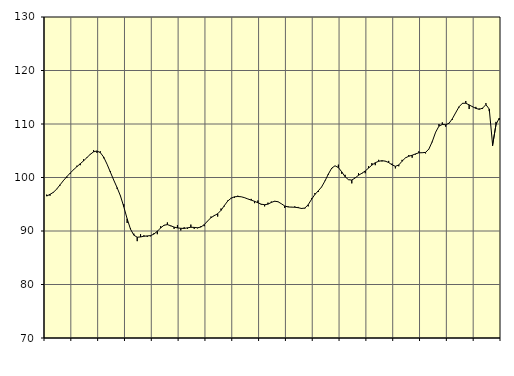
| Category | Piggar | Samtliga fast anställda (inkl. fast anställda utomlands) |
|---|---|---|
| nan | 96.8 | 96.53 |
| 87.0 | 96.6 | 96.85 |
| 87.0 | 97.3 | 97.23 |
| 87.0 | 97.8 | 97.84 |
| nan | 98.5 | 98.64 |
| 88.0 | 99.5 | 99.43 |
| 88.0 | 99.9 | 100.15 |
| 88.0 | 100.7 | 100.82 |
| nan | 101.5 | 101.44 |
| 89.0 | 102.2 | 102.02 |
| 89.0 | 102.3 | 102.57 |
| 89.0 | 103.4 | 103.11 |
| nan | 103.8 | 103.72 |
| 90.0 | 104.4 | 104.33 |
| 90.0 | 105.1 | 104.8 |
| 90.0 | 104.6 | 104.96 |
| nan | 104.9 | 104.65 |
| 91.0 | 103.6 | 103.81 |
| 91.0 | 102.5 | 102.5 |
| 91.0 | 101.2 | 101 |
| nan | 99.5 | 99.51 |
| 92.0 | 97.9 | 98.11 |
| 92.0 | 96.6 | 96.56 |
| 92.0 | 95 | 94.54 |
| nan | 91.5 | 92.28 |
| 93.0 | 90.5 | 90.35 |
| 93.0 | 89.5 | 89.22 |
| 93.0 | 88.1 | 88.84 |
| nan | 89.4 | 88.89 |
| 94.0 | 89.2 | 89.02 |
| 94.0 | 88.9 | 89.08 |
| 94.0 | 89 | 89.14 |
| nan | 89.6 | 89.43 |
| 95.0 | 89.4 | 89.95 |
| 95.0 | 90.9 | 90.58 |
| 95.0 | 91 | 91.08 |
| nan | 91.6 | 91.19 |
| 96.0 | 90.9 | 90.98 |
| 96.0 | 90.4 | 90.73 |
| 96.0 | 91.1 | 90.58 |
| nan | 90.1 | 90.51 |
| 97.0 | 90.7 | 90.48 |
| 97.0 | 90.4 | 90.59 |
| 97.0 | 91.2 | 90.7 |
| nan | 90.4 | 90.67 |
| 98.0 | 90.5 | 90.6 |
| 98.0 | 90.9 | 90.74 |
| 98.0 | 90.9 | 91.19 |
| nan | 91.9 | 91.87 |
| 99.0 | 92.7 | 92.49 |
| 99.0 | 93 | 92.87 |
| 99.0 | 92.7 | 93.23 |
| nan | 94.2 | 93.86 |
| 0.0 | 94.6 | 94.76 |
| 0.0 | 95.7 | 95.6 |
| 0.0 | 96.2 | 96.12 |
| nan | 96.2 | 96.39 |
| 1.0 | 96.6 | 96.45 |
| 1.0 | 96.4 | 96.4 |
| 1.0 | 96.2 | 96.23 |
| nan | 96 | 95.99 |
| 2.0 | 96 | 95.77 |
| 2.0 | 95.2 | 95.55 |
| 2.0 | 95.7 | 95.28 |
| nan | 94.9 | 95.01 |
| 3.0 | 94.6 | 94.91 |
| 3.0 | 95.3 | 95.02 |
| 3.0 | 95.5 | 95.34 |
| nan | 95.5 | 95.57 |
| 4.0 | 95.5 | 95.47 |
| 4.0 | 95.1 | 95.09 |
| 4.0 | 94.3 | 94.68 |
| nan | 94.6 | 94.49 |
| 5.0 | 94.5 | 94.46 |
| 5.0 | 94.6 | 94.44 |
| 5.0 | 94.5 | 94.36 |
| nan | 94.3 | 94.21 |
| 6.0 | 94.2 | 94.29 |
| 6.0 | 94.6 | 94.92 |
| 6.0 | 96.1 | 95.92 |
| nan | 97.1 | 96.83 |
| 7.0 | 97.3 | 97.5 |
| 7.0 | 98.2 | 98.24 |
| 7.0 | 99.4 | 99.35 |
| nan | 100.5 | 100.63 |
| 8.0 | 101.6 | 101.74 |
| 8.0 | 102.2 | 102.19 |
| 8.0 | 102.4 | 101.86 |
| nan | 100.7 | 101.05 |
| 9.0 | 100.5 | 100.15 |
| 9.0 | 99.6 | 99.59 |
| 9.0 | 98.9 | 99.52 |
| nan | 100 | 99.91 |
| 10.0 | 100.8 | 100.42 |
| 10.0 | 100.7 | 100.79 |
| 10.0 | 100.8 | 101.22 |
| nan | 102.1 | 101.76 |
| 11.0 | 102.7 | 102.32 |
| 11.0 | 102.3 | 102.76 |
| 11.0 | 103.3 | 103.03 |
| nan | 103 | 103.14 |
| 12.0 | 103 | 103.06 |
| 12.0 | 103.1 | 102.79 |
| 12.0 | 102.6 | 102.37 |
| nan | 101.7 | 102.09 |
| 13.0 | 102.1 | 102.34 |
| 13.0 | 103.3 | 103.05 |
| 13.0 | 103.7 | 103.67 |
| nan | 104.2 | 103.97 |
| 14.0 | 103.7 | 104.16 |
| 14.0 | 104.3 | 104.41 |
| 14.0 | 104.9 | 104.62 |
| nan | 104.6 | 104.63 |
| 15.0 | 104.5 | 104.69 |
| 15.0 | 105.3 | 105.33 |
| 15.0 | 106.6 | 106.71 |
| nan | 108.5 | 108.46 |
| 16.0 | 110 | 109.61 |
| 16.0 | 110.3 | 109.91 |
| 16.0 | 109.5 | 109.86 |
| nan | 110.2 | 110.14 |
| 17.0 | 110.8 | 110.99 |
| 17.0 | 112.1 | 112.13 |
| 17.0 | 113.1 | 113.23 |
| nan | 113.8 | 113.87 |
| 18.0 | 114.3 | 113.88 |
| 18.0 | 112.8 | 113.57 |
| 18.0 | 113.3 | 113.23 |
| nan | 113.2 | 112.92 |
| 19.0 | 112.9 | 112.74 |
| 19.0 | 112.8 | 112.96 |
| 19.0 | 113.9 | 113.62 |
| nan | 112.4 | 112.79 |
| 20.0 | 105.9 | 106.07 |
| 20.0 | 110.4 | 109.88 |
| 20.0 | 110.8 | 111.12 |